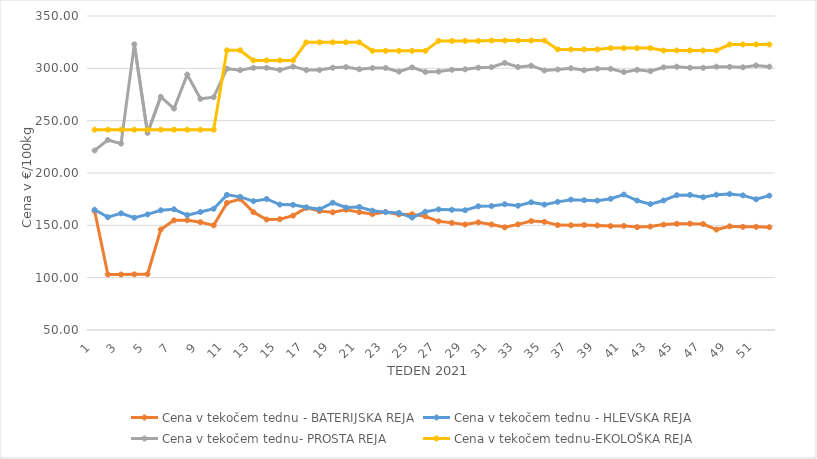
| Category | Cena v tekočem tednu - BATERIJSKA REJA | Cena v tekočem tednu - HLEVSKA REJA | Cena v tekočem tednu- PROSTA REJA | Cena v tekočem tednu-EKOLOŠKA REJA |
|---|---|---|---|---|
| 1.0 | 163.81 | 164.86 | 221.55 | 241.38 |
| 2.0 | 103.02 | 157.81 | 231.55 | 241.38 |
| 3.0 | 103.03 | 161.48 | 228.1 | 241.38 |
| 4.0 | 103.15 | 157.29 | 322.93 | 241.38 |
| 5.0 | 103.34 | 160.43 | 238.28 | 241.38 |
| 6.0 | 146.03 | 164.39 | 272.76 | 241.38 |
| 7.0 | 154.77 | 165.34 | 261.55 | 241.38 |
| 8.0 | 154.86 | 159.79 | 293.97 | 241.38 |
| 9.0 | 153 | 162.73 | 270.86 | 241.38 |
| 10.0 | 149.98 | 165.85 | 272.41 | 241.38 |
| 11.0 | 171.4 | 179.09 | 299.66 | 317.24 |
| 12.0 | 175.2 | 177.21 | 298.27 | 317.24 |
| 13.0 | 162.57 | 173.07 | 300.45 | 307.59 |
| 14.0 | 155.55 | 175.17 | 300.49 | 307.59 |
| 15.0 | 155.88 | 169.83 | 298.52 | 307.59 |
| 16.0 | 159.26 | 169.55 | 301.6 | 307.59 |
| 17.0 | 166.66 | 167.25 | 298.38 | 324.83 |
| 18.0 | 163.58 | 165.28 | 298.35 | 324.83 |
| 19.0 | 162.44 | 171.6 | 300.59 | 324.83 |
| 20.0 | 164.94 | 167.01 | 301.21 | 324.83 |
| 21.0 | 162.64 | 167.56 | 299.14 | 324.83 |
| 22.0 | 160.68 | 164.01 | 300.34 | 316.72 |
| 23.0 | 162.75 | 162.58 | 300.35 | 316.72 |
| 24.0 | 160.34 | 161.89 | 296.9 | 316.72 |
| 25.0 | 160.61 | 157.42 | 300.86 | 316.72 |
| 26.0 | 158.57 | 163.03 | 296.55 | 316.72 |
| 27.0 | 153.83 | 165.23 | 296.9 | 326.21 |
| 28.0 | 152.35 | 164.83 | 298.63 | 326.21 |
| 29.0 | 150.79 | 164.42 | 299.08 | 326.21 |
| 30.0 | 152.82 | 168.2 | 300.63 | 326.21 |
| 31.0 | 150.8 | 168.4 | 301.07 | 326.55 |
| 32.0 | 148.1 | 170.19 | 305.2 | 326.55 |
| 33.0 | 150.88 | 168.74 | 301.25 | 326.55 |
| 34.0 | 154.04 | 172.03 | 302.51 | 326.55 |
| 35.0 | 153.37 | 169.81 | 297.92 | 326.55 |
| 36.0 | 150.21 | 172.4 | 298.86 | 318.1 |
| 37.0 | 150.06 | 174.54 | 300.07 | 318.1 |
| 38.0 | 150.32 | 173.99 | 298.12 | 318.1 |
| 39.0 | 149.86 | 173.58 | 299.58 | 318.1 |
| 40.0 | 149.34 | 175.36 | 299.56 | 319.31 |
| 41.0 | 149.48 | 179.4 | 296.38 | 319.31 |
| 42.0 | 148.32 | 173.69 | 298.56 | 319.31 |
| 43.0 | 148.83 | 170.3 | 297.28 | 319.31 |
| 44.0 | 150.69 | 173.75 | 300.93 | 317.07 |
| 45.0 | 151.41 | 178.77 | 301.53 | 317.07 |
| 46.0 | 151.56 | 179.05 | 300.59 | 317.07 |
| 47.0 | 151.2 | 176.86 | 300.49 | 317.07 |
| 48.0 | 145.97 | 179.22 | 301.57 | 317.07 |
| 49.0 | 149.07 | 179.96 | 301.45 | 322.76 |
| 50.0 | 148.55 | 178.63 | 301.01 | 322.76 |
| 51.0 | 148.55 | 174.89 | 302.73 | 322.76 |
| 52.0 | 148.22 | 178.35 | 301.56 | 322.76 |